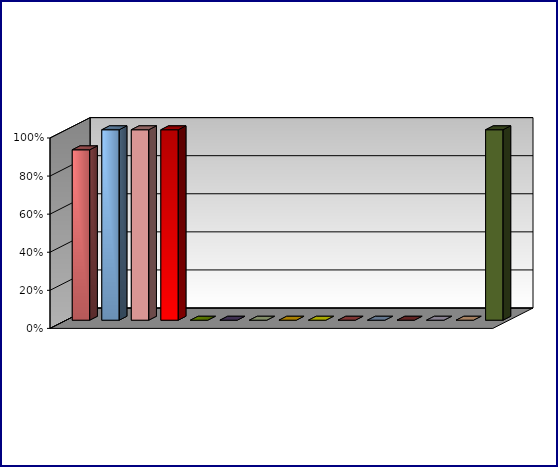
| Category | Series 0 | Series 1 |
|---|---|---|
| 0 | 0.895 |  |
| 1 | 1 |  |
| 2 | 1 |  |
| 3 | 1 |  |
| 4 | 0 |  |
| 5 | 0 |  |
| 6 | 0 |  |
| 7 | 0 |  |
| 8 | 0 |  |
| 9 | 0 |  |
| 10 | 0 |  |
| 11 | 0 |  |
| 12 | 0 |  |
| 13 | 0 |  |
| 14 | 1 |  |